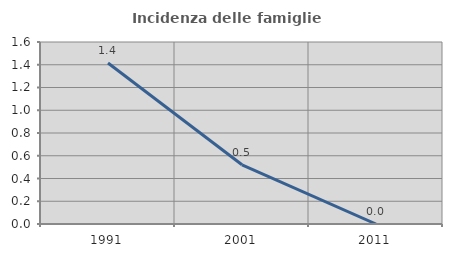
| Category | Incidenza delle famiglie numerose |
|---|---|
| 1991.0 | 1.415 |
| 2001.0 | 0.521 |
| 2011.0 | 0 |